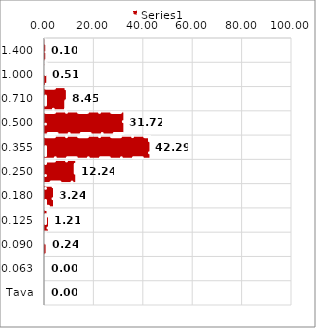
| Category | Series 0 |
|---|---|
| 1,400 | 0.1 |
| 1,000 | 0.51 |
| 0,710 | 8.45 |
| 0,500 | 31.72 |
| 0,355 | 42.29 |
| 0,250 | 12.24 |
| 0,180 | 3.24 |
| 0,125 | 1.21 |
| 0,090 | 0.24 |
| 0,063 | 0 |
| Tava | 0 |